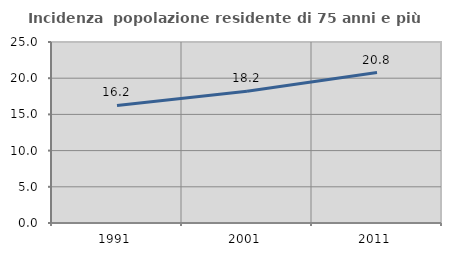
| Category | Incidenza  popolazione residente di 75 anni e più |
|---|---|
| 1991.0 | 16.24 |
| 2001.0 | 18.187 |
| 2011.0 | 20.776 |